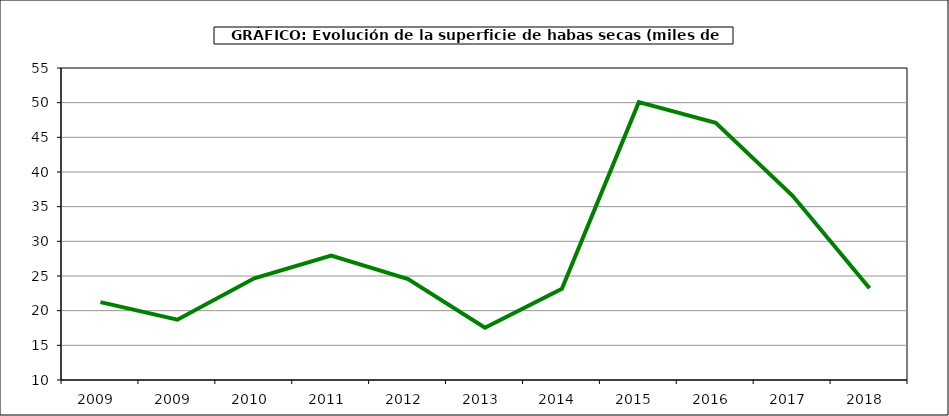
| Category | Superficie |
|---|---|
| 2009.0 | 21.228 |
| 2009.0 | 18.704 |
| 2010.0 | 24.675 |
| 2011.0 | 27.957 |
| 2012.0 | 24.564 |
| 2013.0 | 17.542 |
| 2014.0 | 23.165 |
| 2015.0 | 50.072 |
| 2016.0 | 47.109 |
| 2017.0 | 36.574 |
| 2018.0 | 23.234 |